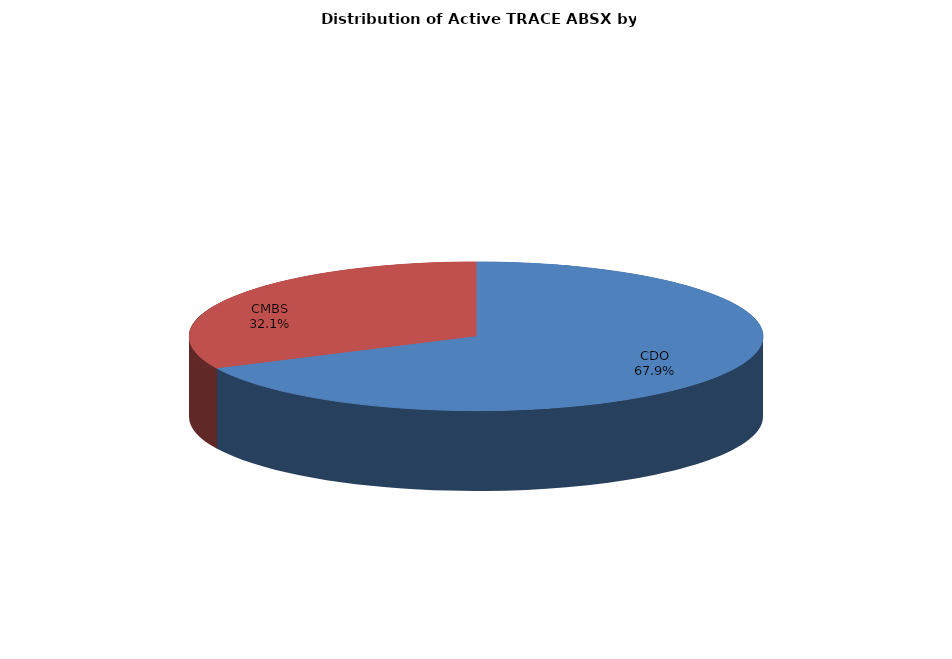
| Category | Series 0 |
|---|---|
| CDO | 79932 |
| CMBS | 37793 |